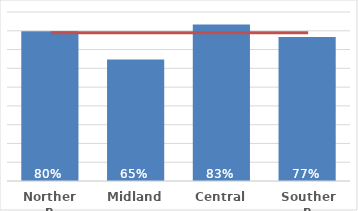
| Category | Pacific |
|---|---|
| Northern | 0.798 |
| Midland | 0.647 |
| Central | 0.834 |
| Southern | 0.766 |